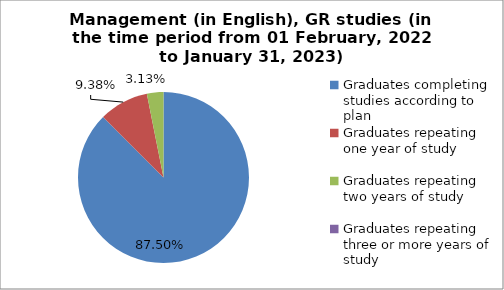
| Category | Series 0 |
|---|---|
| Graduates completing studies according to plan | 87.5 |
| Graduates repeating one year of study | 9.375 |
| Graduates repeating two years of study | 3.125 |
| Graduates repeating three or more years of study | 0 |